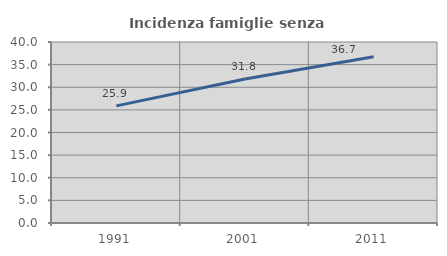
| Category | Incidenza famiglie senza nuclei |
|---|---|
| 1991.0 | 25.88 |
| 2001.0 | 31.842 |
| 2011.0 | 36.724 |